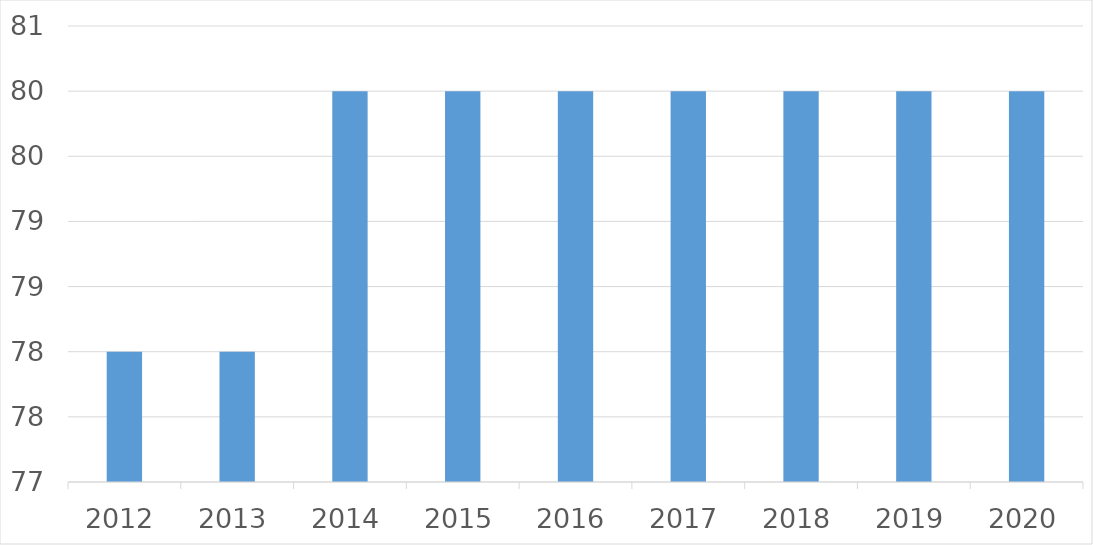
| Category | Series 0 |
|---|---|
| 2012 | 78 |
| 2013 | 78 |
| 2014 | 80 |
| 2015 | 80 |
| 2016 | 80 |
| 2017 | 80 |
| 2018 | 80 |
| 2019 | 80 |
| 2020 | 80 |